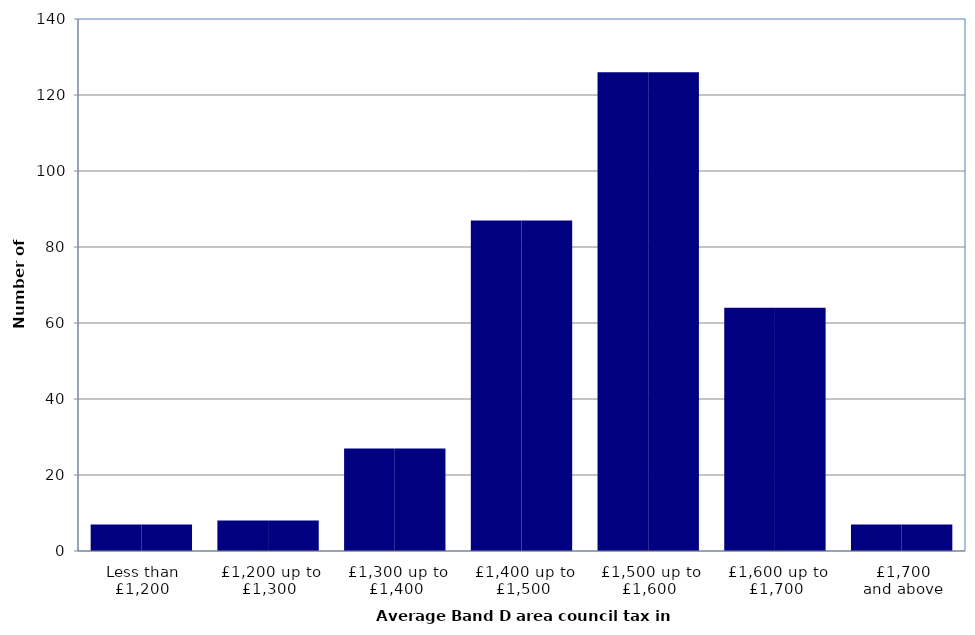
| Category | Area CT 2015-16 (£) |
|---|---|
| Less than
£1,200 | 7 |
| £1,200 up to £1,300 | 8 |
| £1,300 up to £1,400 | 27 |
| £1,400 up to £1,500 | 87 |
| £1,500 up to £1,600 | 126 |
| £1,600 up to £1,700 | 64 |
| £1,700
and above | 7 |